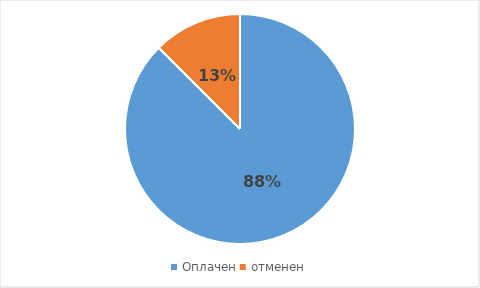
| Category | Series 0 |
|---|---|
| Оплачен | 0.875 |
| отменен | 0.125 |